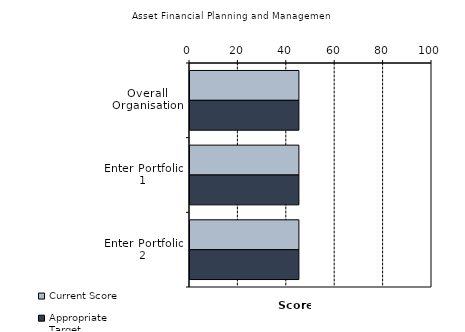
| Category | Current Score | Appropriate Target |
|---|---|---|
| Overall Organisation | 45 | 45 |
| Enter Portfolio 1 | 45 | 45 |
| Enter Portfolio 2 | 45 | 45 |